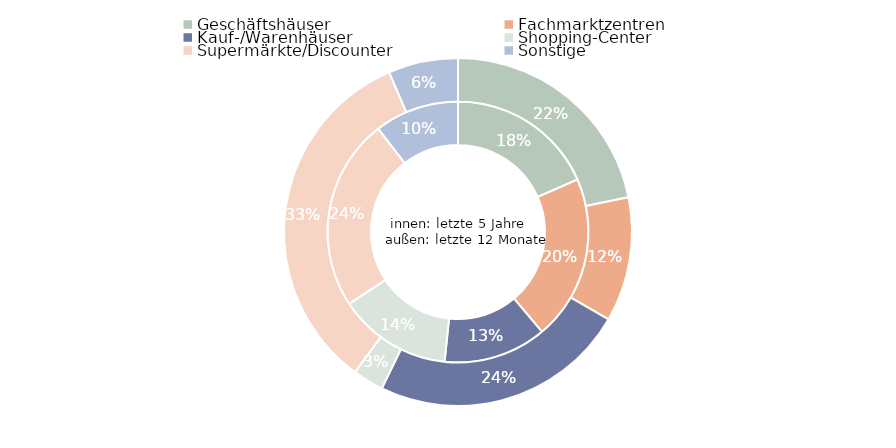
| Category | Series 1 | Series 0 |
|---|---|---|
| Geschäftshäuser | 1671103491.282 | 1322829834 |
| Fachmarktzentren | 1856951664.09 | 702304525 |
| Kauf-/Warenhäuser | 1160932182.858 | 1446510585 |
| Shopping-Center | 1278097530.186 | 174637151 |
| Supermärkte/Discounter | 2161720044.926 | 2028371161.3 |
| Sonstige | 949964171.258 | 393113198 |